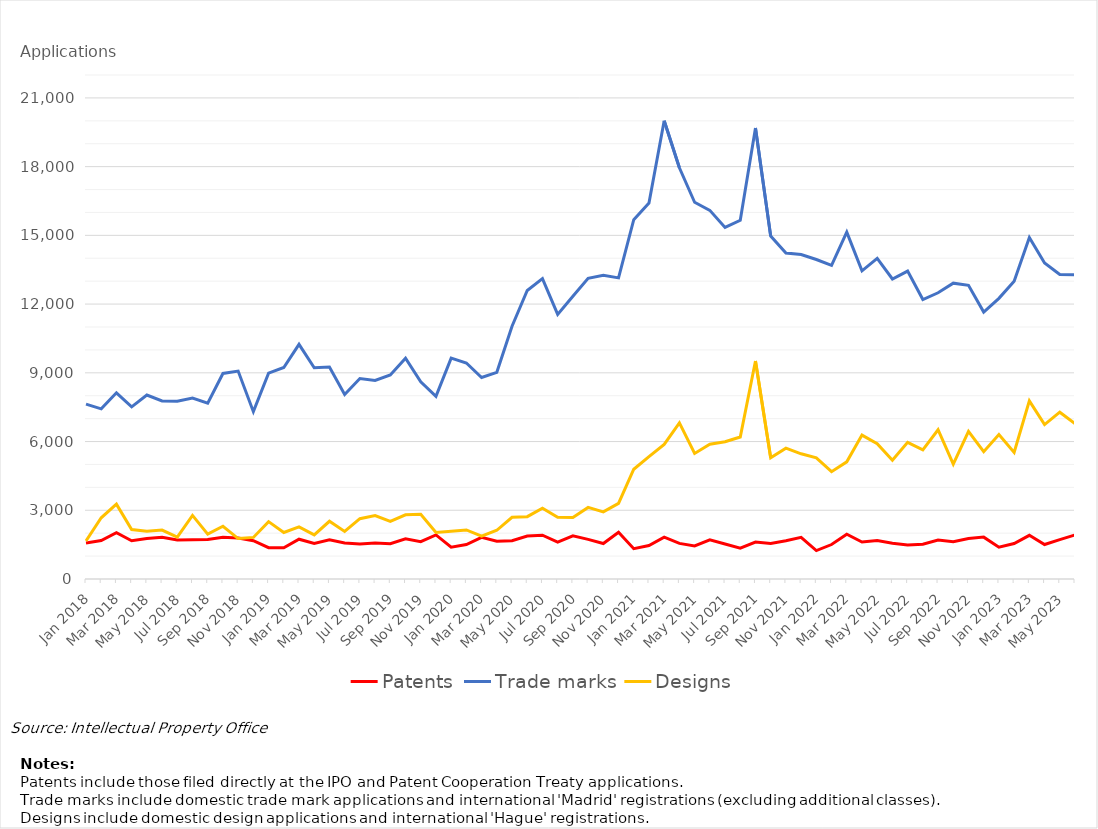
| Category | Patents | Trade marks | Designs |
|---|---|---|---|
| Jan 2018 | 1575 | 7634 | 1658 |
| Feb 2018 | 1676 | 7428 | 2672 |
| Mar 2018 | 2022 | 8127 | 3267 |
| Apr 2018 | 1670 | 7512 | 2160 |
| May 2018 | 1767 | 8030 | 2083 |
| Jun 2018 | 1821 | 7769 | 2136 |
| Jul 2018 | 1704 | 7757 | 1832 |
| Aug 2018 | 1713 | 7897 | 2777 |
| Sep 2018 | 1725 | 7673 | 1960 |
| Oct 2018 | 1818 | 8972 | 2302 |
| Nov 2018 | 1787 | 9076 | 1765 |
| Dec 2018 | 1670 | 7304 | 1815 |
| Jan 2019 | 1367 | 8985 | 2505 |
| Feb 2019 | 1361 | 9234 | 2031 |
| Mar 2019 | 1737 | 10243 | 2274 |
| Apr 2019 | 1552 | 9219 | 1923 |
| May 2019 | 1710 | 9251 | 2520 |
| Jun 2019 | 1569 | 8053 | 2074 |
| Jul 2019 | 1527 | 8752 | 2634 |
| Aug 2019 | 1571 | 8670 | 2768 |
| Sep 2019 | 1540 | 8908 | 2511 |
| Oct 2019 | 1755 | 9636 | 2800 |
| Nov 2019 | 1630 | 8607 | 2827 |
| Dec 2019 | 1926 | 7970 | 2028 |
| Jan 2020 | 1391 | 9642 | 2082 |
| Feb 2020 | 1504 | 9428 | 2143 |
| Mar 2020 | 1819 | 8794 | 1872 |
| Apr 2020 | 1648 | 9021 | 2127 |
| May 2020 | 1672 | 11035 | 2695 |
| Jun 2020 | 1879 | 12593 | 2721 |
| Jul 2020 | 1912 | 13110 | 3086 |
| Aug 2020 | 1613 | 11551 | 2695 |
| Sep 2020 | 1886 | 12340 | 2686 |
| Oct 2020 | 1730 | 13126 | 3124 |
| Nov 2020 | 1547 | 13254 | 2930 |
| Dec 2020 | 2042 | 13144 | 3302 |
| Jan 2021 | 1324 | 15685 | 4792 |
| Feb 2021 | 1462 | 16413 | 5340 |
| Mar 2021 | 1828 | 20001 | 5878 |
| Apr 2021 | 1554 | 17951 | 6815 |
| May 2021 | 1446 | 16446 | 5480 |
| Jun 2021 | 1712 | 16091 | 5881 |
| Jul 2021 | 1528 | 15345 | 5989 |
| Aug 2021 | 1344 | 15659 | 6200 |
| Sep 2021 | 1615 | 19685 | 9517 |
| Oct 2021 | 1547 | 14968 | 5292 |
| Nov 2021 | 1670 | 14232 | 5712 |
| Dec 2021 | 1817 | 14162 | 5464 |
| Jan 2022 | 1240 | 13945 | 5288 |
| Feb 2022 | 1505 | 13691 | 4683 |
| Mar 2022 | 1952 | 15142 | 5114 |
| Apr 2022 | 1616 | 13450 | 6282 |
| May 2022 | 1683 | 13992 | 5907 |
| Jun 2022 | 1559 | 13096 | 5183 |
| Jul 2022 | 1485 | 13439 | 5963 |
| Aug 2022 | 1519 | 12197 | 5639 |
| Sep 2022 | 1702 | 12493 | 6515 |
| Oct 2022 | 1630 | 12914 | 5012 |
| Nov 2022 | 1770 | 12819 | 6446 |
| Dec 2022 | 1828 | 11650 | 5558 |
| Jan 2023 | 1391 | 12250 | 6307 |
| Feb 2023 | 1551 | 13001 | 5528 |
| Mar 2023 | 1906 | 14909 | 7775 |
| Apr 2023 | 1506 | 13792 | 6739 |
| May 2023 | 1718 | 13289 | 7281 |
| Jun 2023 | 1924 | 13280 | 6787 |